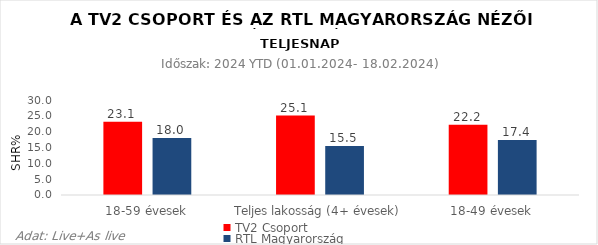
| Category | TV2 Csoport | RTL Magyarország |
|---|---|---|
| 18-59 évesek | 23.1 | 18 |
| Teljes lakosság (4+ évesek) | 25.1 | 15.5 |
| 18-49 évesek | 22.2 | 17.4 |